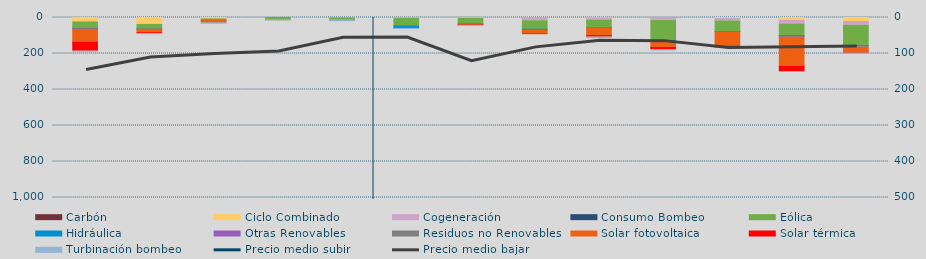
| Category | Carbón | Ciclo Combinado | Cogeneración | Consumo Bombeo | Eólica | Hidráulica | Otras Renovables | Residuos no Renovables | Solar fotovoltaica | Solar térmica | Turbinación bombeo |
|---|---|---|---|---|---|---|---|---|---|---|---|
| 0 | 0 | 23416.9 | 1799.3 | 0 | 36710.1 | 169.9 | 2791.7 | 130.2 | 72190.6 | 49997.5 | 140 |
| 1 | 0 | 38168.9 | 488.4 | 0 | 26054.9 | 21.9 | 466.4 | 0 | 19329.3 | 4158.9 | 1184.2 |
| 2 | 0 | 7357.7 | 1214.8 | 0 | 7240.9 | 133.6 | 501.7 | 0 | 12900.5 | 0 | 280 |
| 3 | 0 | 0 | 195.2 | 0 | 11271.7 | 31.8 | 43.5 | 0 | 327.2 | 72.2 | 190.9 |
| 4 | 0 | 1594 | 466.5 | 0 | 10201.8 | 124.4 | 68.4 | 0 | 144.3 | 50.3 | 5089.6 |
| 5 | 0 | 0 | 5902.2 | 0 | 40924.6 | 10096 | 2210.8 | 541.2 | 397.2 | 861 | 700 |
| 6 | 0 | 2180.9 | 2937.8 | 0 | 30839.8 | 1899.6 | 565.6 | 0 | 1849.2 | 2802 | 1100 |
| 7 | 0 | 0 | 18046.2 | 0 | 47159 | 4513.5 | 523.7 | 0 | 19900.6 | 2658.1 | 0 |
| 8 | 0 | 2280 | 11810.8 | 0 | 43127.1 | 1164.1 | 1123.7 | 0 | 41530.2 | 8077.8 | 3040.7 |
| 9 | 0 | 0 | 17047.5 | 0 | 112869.5 | 3513.3 | 2033.2 | 0 | 31386.8 | 12440.9 | 1549.6 |
| 10 | 0 | 5564.7 | 13323.5 | 0 | 59321.6 | 487.1 | 2690.6 | 340 | 78205.9 | 6474.7 | 234.9 |
| 11 | 0 | 16258.4 | 19750 | 0 | 65114.4 | 2681.9 | 4946 | 396 | 162175.4 | 30259.6 | 0 |
| 12 | 0 | 22358.6 | 20882.5 | 0 | 113586.9 | 821.8 | 5978.7 | 1618 | 30024.6 | 2441 | 100 |